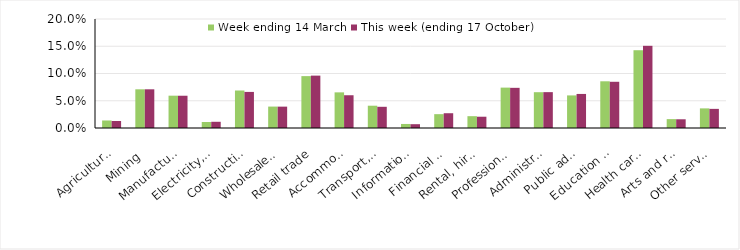
| Category | Week ending 14 March | This week (ending 17 October) |
|---|---|---|
| Agriculture, forestry and fishing | 0.014 | 0.013 |
| Mining | 0.071 | 0.071 |
| Manufacturing | 0.059 | 0.059 |
| Electricity, gas, water and waste services | 0.011 | 0.011 |
| Construction | 0.069 | 0.066 |
| Wholesale trade | 0.039 | 0.039 |
| Retail trade | 0.095 | 0.096 |
| Accommodation and food services | 0.065 | 0.06 |
| Transport, postal and warehousing | 0.041 | 0.039 |
| Information media and telecommunications | 0.007 | 0.007 |
| Financial and insurance services | 0.025 | 0.027 |
| Rental, hiring and real estate services | 0.022 | 0.021 |
| Professional, scientific and technical services | 0.074 | 0.074 |
| Administrative and support services | 0.066 | 0.066 |
| Public administration and safety | 0.06 | 0.062 |
| Education and training | 0.086 | 0.085 |
| Health care and social assistance | 0.143 | 0.151 |
| Arts and recreation services | 0.016 | 0.016 |
| Other services | 0.036 | 0.035 |